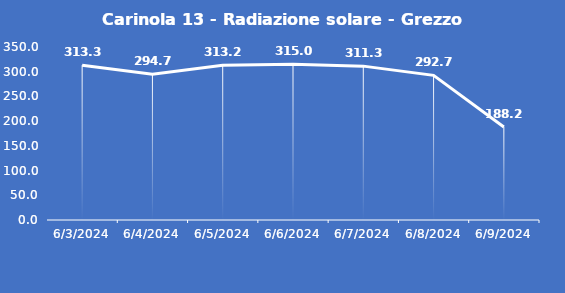
| Category | Carinola 13 - Radiazione solare - Grezzo (W/m2) |
|---|---|
| 6/3/24 | 313.3 |
| 6/4/24 | 294.7 |
| 6/5/24 | 313.2 |
| 6/6/24 | 315 |
| 6/7/24 | 311.3 |
| 6/8/24 | 292.7 |
| 6/9/24 | 188.2 |